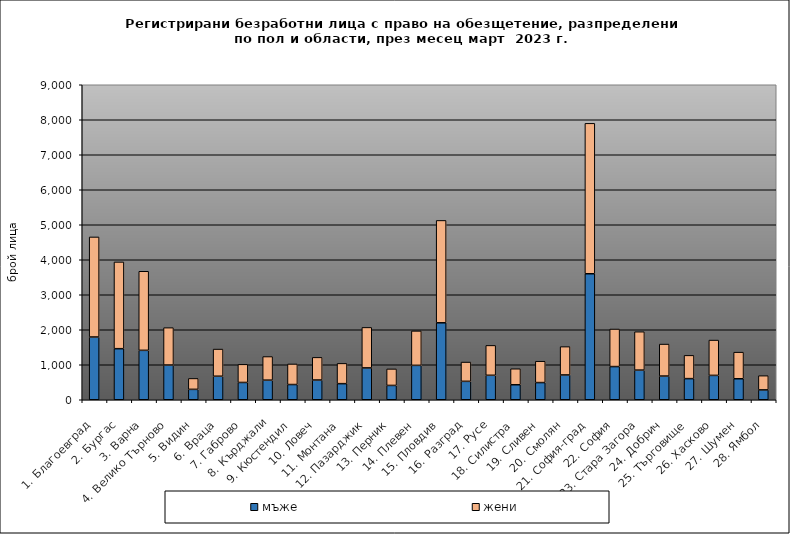
| Category | мъже | жени |
|---|---|---|
| 1. Благоевград | 1793 | 2859 |
| 2. Бургас | 1459 | 2479 |
| 3. Варна | 1412 | 2259 |
| 4. Велико Търново | 992 | 1068 |
| 5. Видин | 297 | 312 |
| 6. Враца | 672 | 776 |
| 7. Габрово | 494 | 518 |
| 8. Кърджали | 560 | 674 |
| 9. Кюстендил | 435 | 588 |
| 10. Ловеч | 564 | 647 |
| 11. Монтана | 460 | 579 |
| 12. Пазарджик | 910 | 1157 |
| 13. Перник | 409 | 472 |
| 14. Плевен | 983 | 984 |
| 15. Пловдив | 2199 | 2925 |
| 16. Разград | 526 | 551 |
| 17. Русе | 699 | 854 |
| 18. Силистра | 429 | 457 |
| 19. Сливен | 491 | 610 |
| 20. Смолян | 709 | 809 |
| 21. София-град | 3600 | 4298 |
| 22. София | 948 | 1073 |
| 23. Стара Загора | 847 | 1097 |
| 24. Добрич | 677 | 914 |
| 25. Търговище | 604 | 664 |
| 26. Хасково | 696 | 1009 |
| 27. Шумен | 600 | 760 |
| 28. Ямбол | 282 | 406 |